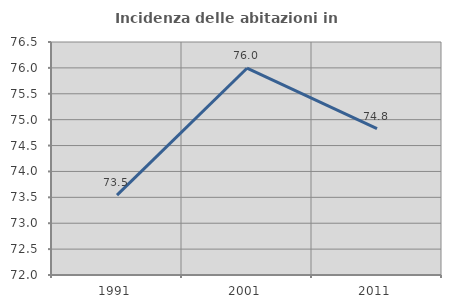
| Category | Incidenza delle abitazioni in proprietà  |
|---|---|
| 1991.0 | 73.543 |
| 2001.0 | 75.993 |
| 2011.0 | 74.826 |